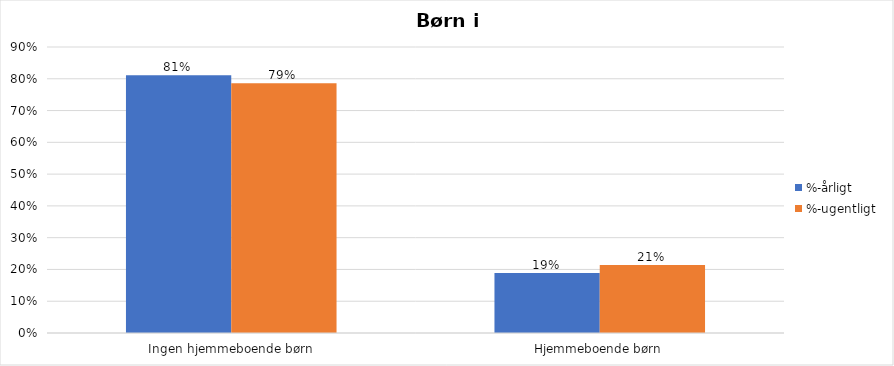
| Category | %-årligt | %-ugentligt |
|---|---|---|
| Ingen hjemmeboende børn | 0.811 | 0.786 |
| Hjemmeboende børn | 0.189 | 0.214 |